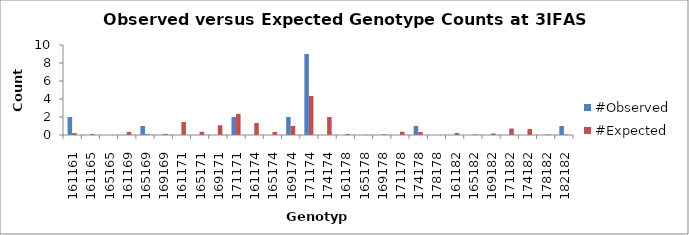
| Category | #Observed | #Expected |
|---|---|---|
| 161161.0 | 2 | 0.222 |
| 161165.0 | 0 | 0.111 |
| 165165.0 | 0 | 0.014 |
| 161169.0 | 0 | 0.333 |
| 165169.0 | 1 | 0.083 |
| 169169.0 | 0 | 0.125 |
| 161171.0 | 0 | 1.444 |
| 165171.0 | 0 | 0.361 |
| 169171.0 | 0 | 1.083 |
| 171171.0 | 2 | 2.347 |
| 161174.0 | 0 | 1.333 |
| 165174.0 | 0 | 0.333 |
| 169174.0 | 2 | 1 |
| 171174.0 | 9 | 4.333 |
| 174174.0 | 0 | 2 |
| 161178.0 | 0 | 0.111 |
| 165178.0 | 0 | 0.028 |
| 169178.0 | 0 | 0.083 |
| 171178.0 | 0 | 0.361 |
| 174178.0 | 1 | 0.333 |
| 178178.0 | 0 | 0.014 |
| 161182.0 | 0 | 0.222 |
| 165182.0 | 0 | 0.056 |
| 169182.0 | 0 | 0.167 |
| 171182.0 | 0 | 0.722 |
| 174182.0 | 0 | 0.667 |
| 178182.0 | 0 | 0.056 |
| 182182.0 | 1 | 0.056 |